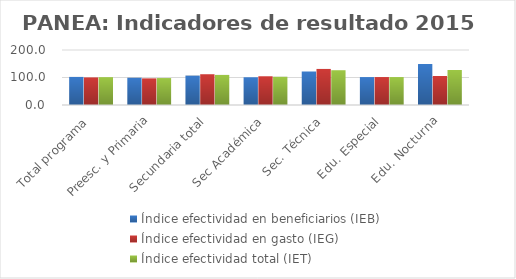
| Category | Índice efectividad en beneficiarios (IEB) | Índice efectividad en gasto (IEG)  | Índice efectividad total (IET) |
|---|---|---|---|
| Total programa | 102.124 | 100.372 | 101.248 |
| Preesc. y Primaria | 99.128 | 96.833 | 97.981 |
| Secundaria total | 106.887 | 111.88 | 109.383 |
| Sec Académica | 100.866 | 104.483 | 102.675 |
| Sec. Técnica | 121.826 | 131.147 | 126.486 |
| Edu. Especial | 101.556 | 101.653 | 101.605 |
| Edu. Nocturna | 148.992 | 105.539 | 127.265 |